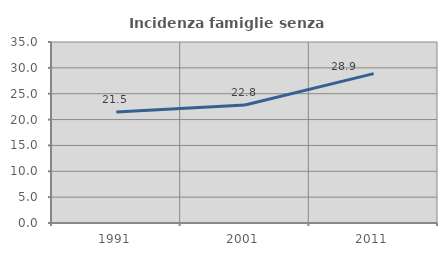
| Category | Incidenza famiglie senza nuclei |
|---|---|
| 1991.0 | 21.472 |
| 2001.0 | 22.822 |
| 2011.0 | 28.889 |